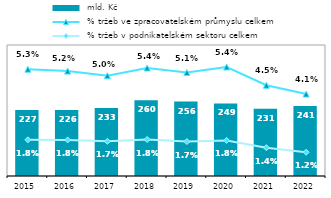
| Category |  mld. Kč |
|---|---|
| 2015.0 | 226.828 |
| 2016.0 | 226.336 |
| 2017.0 | 233.272 |
| 2018.0 | 260.301 |
| 2019.0 | 255.587 |
| 2020.0 | 249.315 |
| 2021.0 | 231.363 |
| 2022.0 | 240.672 |